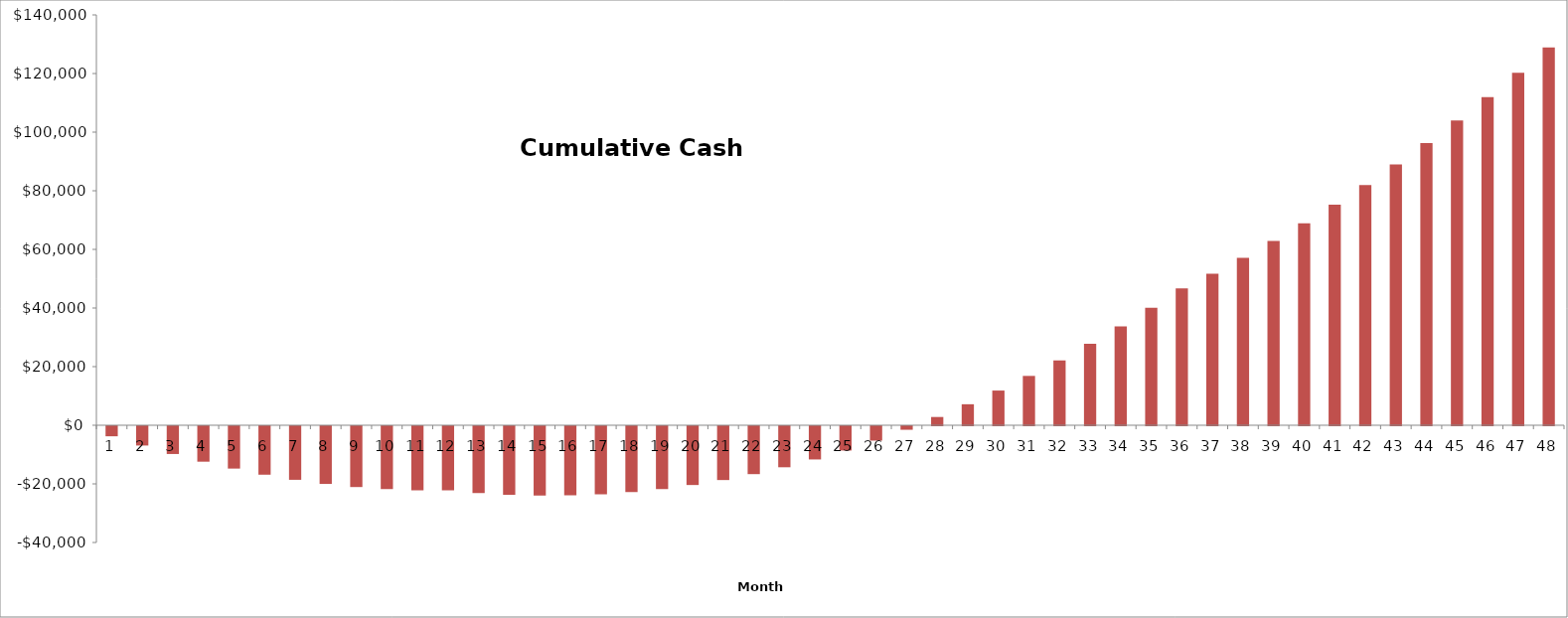
| Category | Monthly Cumulative Cash Flow |
|---|---|
| 0 | -3425.312 |
| 1 | -6582.708 |
| 2 | -9472.188 |
| 3 | -12093.75 |
| 4 | -14447.396 |
| 5 | -16533.125 |
| 6 | -18278.021 |
| 7 | -19682.083 |
| 8 | -20745.313 |
| 9 | -21467.708 |
| 10 | -21849.271 |
| 11 | -21890 |
| 12 | -22804.833 |
| 13 | -23392.229 |
| 14 | -23652.188 |
| 15 | -23584.708 |
| 16 | -23189.792 |
| 17 | -22467.438 |
| 18 | -21421.292 |
| 19 | -20051.354 |
| 20 | -18357.625 |
| 21 | -16340.104 |
| 22 | -13998.792 |
| 23 | -11333.688 |
| 24 | -8281.469 |
| 25 | -4905.458 |
| 26 | -1205.656 |
| 27 | 2817.937 |
| 28 | 7165.323 |
| 29 | 11836.5 |
| 30 | 16831.469 |
| 31 | 22150.229 |
| 32 | 27792.781 |
| 33 | 33759.125 |
| 34 | 40049.26 |
| 35 | 46663.187 |
| 36 | 51734.156 |
| 37 | 57128.917 |
| 38 | 62847.469 |
| 39 | 68889.812 |
| 40 | 75255.948 |
| 41 | 81945.875 |
| 42 | 88959.594 |
| 43 | 96297.104 |
| 44 | 103958.406 |
| 45 | 111943.5 |
| 46 | 120252.385 |
| 47 | 128885.062 |